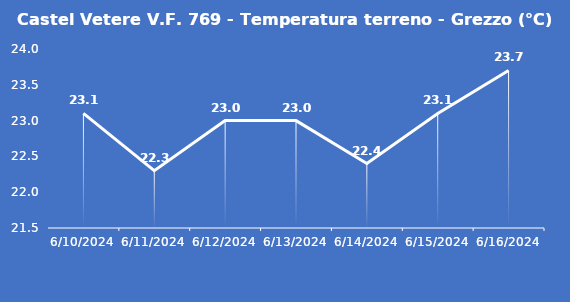
| Category | Castel Vetere V.F. 769 - Temperatura terreno - Grezzo (°C) |
|---|---|
| 6/10/24 | 23.1 |
| 6/11/24 | 22.3 |
| 6/12/24 | 23 |
| 6/13/24 | 23 |
| 6/14/24 | 22.4 |
| 6/15/24 | 23.1 |
| 6/16/24 | 23.7 |